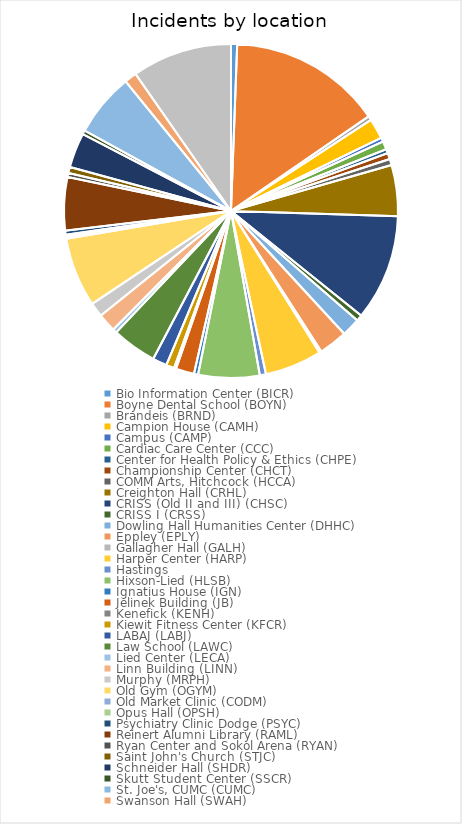
| Category | Series 0 |
|---|---|
| Bio Information Center (BICR)  | 3 |
| Boyne Dental School (BOYN)  | 75 |
| Brandeis (BRND)  | 2 |
| Campion House (CAMH)  | 10 |
| Campus (CAMP)  | 2 |
| Cardiac Care Center (CCC)  | 4 |
| Center for Health Policy & Ethics (CHPE)  | 2 |
| Championship Center (CHCT)  | 3 |
| COMM Arts, Hitchcock (HCCA)  | 3 |
| Creighton Hall (CRHL)  | 25 |
| CRISS (Old II and III) (CHSC)  | 52 |
| CRISS I (CRSS)  | 3 |
| Dowling Hall Humanities Center (DHHC)  | 9 |
| Eppley (EPLY)  | 14 |
| Gallagher Hall (GALH)  | 1 |
| Harper Center (HARP)  | 28 |
| Hastings | 3 |
| Hixson-Lied (HLSB)  | 30 |
| Ignatius House (IGN)  | 2 |
| Jelinek Building (JB)  | 9 |
| Kenefick (KENH)  | 1 |
| Kiewit Fitness Center (KFCR)  | 4 |
| LABAJ (LABJ)  | 7 |
| Law School (LAWC)  | 22 |
| Lied Center (LECA)  | 2 |
| Linn Building (LINN)  | 9 |
| Murphy (MRPH)  | 7 |
| Old Gym (OGYM)  | 34 |
| Old Market Clinic (CODM)  | 1 |
| Opus Hall (OPSH)  | 1 |
| Psychiatry Clinic Dodge (PSYC)  | 2 |
| Reinert Alumni Library (RAML)  | 26 |
| Ryan Center and Sokol Arena (RYAN)  | 2 |
| Saint John's Church (STJC)  | 3 |
| Schneider Hall (SHDR)  | 17 |
| Skutt Student Center (SSCR)  | 2 |
| St. Joe's, CUMC (CUMC)  | 31 |
| Swanson Hall (SWAH)  | 6 |
| Wareham Building (WARE)  | 49 |